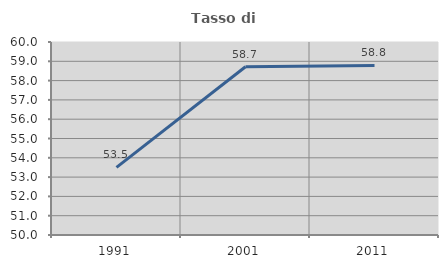
| Category | Tasso di occupazione   |
|---|---|
| 1991.0 | 53.505 |
| 2001.0 | 58.717 |
| 2011.0 | 58.789 |